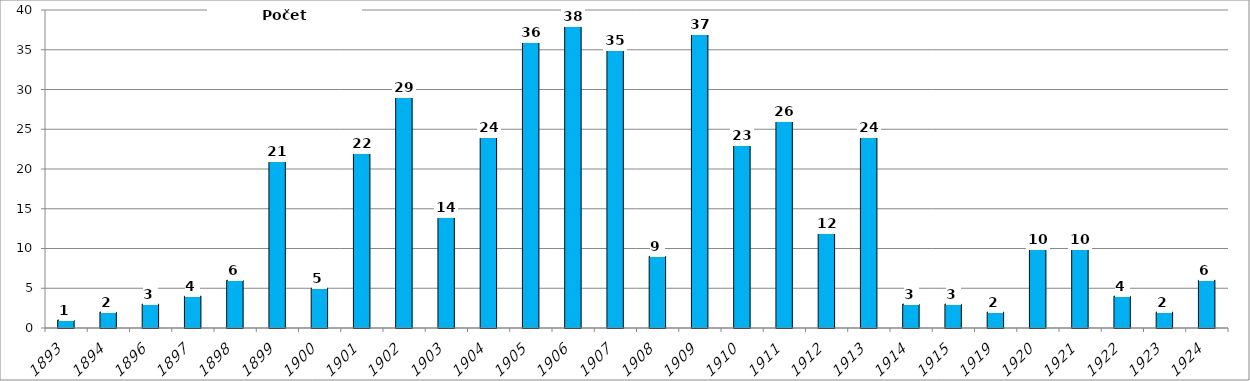
| Category | Počet vysťahovalcov. |
|---|---|
| 1893.0 | 1 |
| 1894.0 | 2 |
| 1896.0 | 3 |
| 1897.0 | 4 |
| 1898.0 | 6 |
| 1899.0 | 21 |
| 1900.0 | 5 |
| 1901.0 | 22 |
| 1902.0 | 29 |
| 1903.0 | 14 |
| 1904.0 | 24 |
| 1905.0 | 36 |
| 1906.0 | 38 |
| 1907.0 | 35 |
| 1908.0 | 9 |
| 1909.0 | 37 |
| 1910.0 | 23 |
| 1911.0 | 26 |
| 1912.0 | 12 |
| 1913.0 | 24 |
| 1914.0 | 3 |
| 1915.0 | 3 |
| 1919.0 | 2 |
| 1920.0 | 10 |
| 1921.0 | 10 |
| 1922.0 | 4 |
| 1923.0 | 2 |
| 1924.0 | 6 |